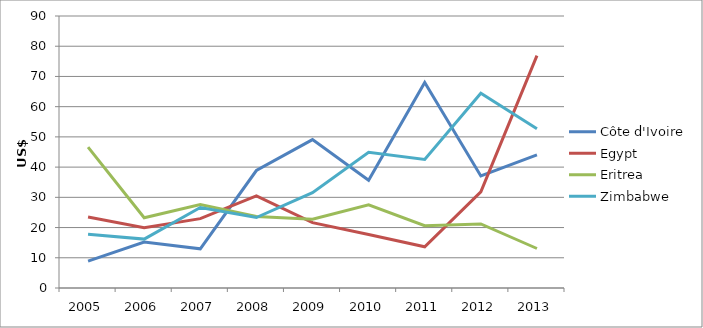
| Category | Côte d'Ivoire | Egypt | Eritrea | Zimbabwe |
|---|---|---|---|---|
| 2005.0 | 8.907 | 23.484 | 46.629 | 17.812 |
| 2006.0 | 15.177 | 19.943 | 23.226 | 16.183 |
| 2007.0 | 12.96 | 22.955 | 27.595 | 26.633 |
| 2008.0 | 38.871 | 30.48 | 23.652 | 23.315 |
| 2009.0 | 49.09 | 21.638 | 22.771 | 31.521 |
| 2010.0 | 35.627 | 17.678 | 27.553 | 44.922 |
| 2011.0 | 67.984 | 13.639 | 20.614 | 42.533 |
| 2012.0 | 37.089 | 31.783 | 21.182 | 64.442 |
| 2013.0 | 44.066 | 76.91 | 13.07 | 52.695 |